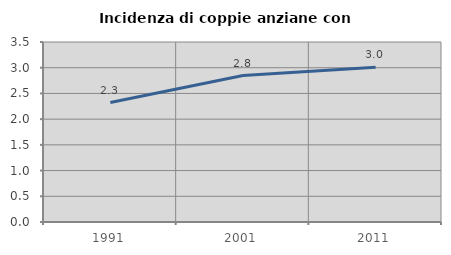
| Category | Incidenza di coppie anziane con figli |
|---|---|
| 1991.0 | 2.322 |
| 2001.0 | 2.847 |
| 2011.0 | 3.008 |